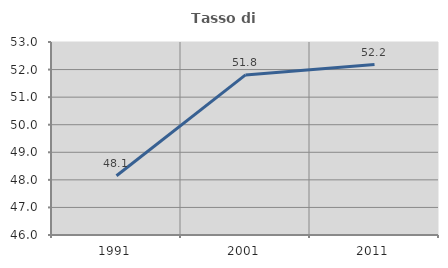
| Category | Tasso di occupazione   |
|---|---|
| 1991.0 | 48.148 |
| 2001.0 | 51.806 |
| 2011.0 | 52.183 |